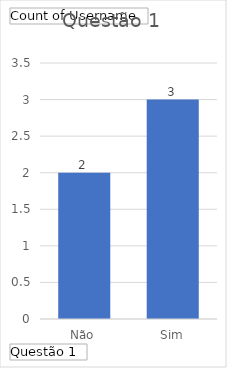
| Category | Total |
|---|---|
| Não | 2 |
| Sim | 3 |